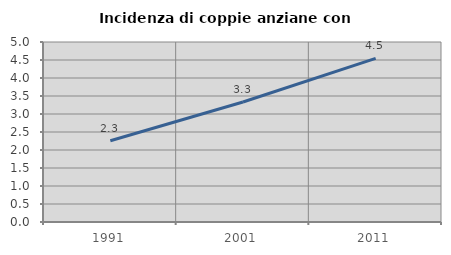
| Category | Incidenza di coppie anziane con figli |
|---|---|
| 1991.0 | 2.256 |
| 2001.0 | 3.333 |
| 2011.0 | 4.545 |